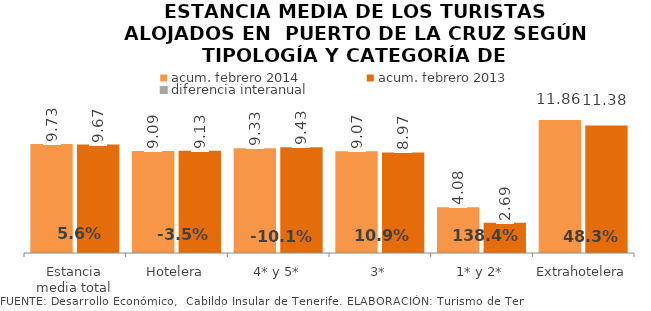
| Category | acum. febrero 2014 | acum. febrero 2013 |
|---|---|---|
| Estancia media total | 9.731 | 9.675 |
| Hotelera | 9.093 | 9.128 |
| 4* y 5* | 9.33 | 9.43 |
| 3* | 9.075 | 8.966 |
| 1* y 2* | 4.078 | 2.694 |
| Extrahotelera | 11.859 | 11.376 |